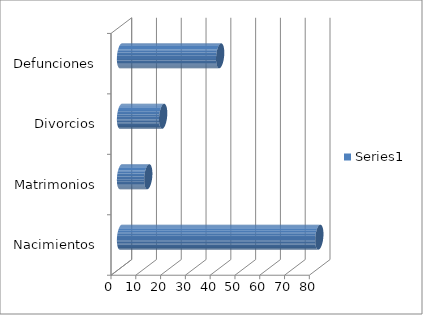
| Category | Series 0 |
|---|---|
| Nacimientos | 80 |
| Matrimonios | 11 |
| Divorcios | 17 |
| Defunciones | 40 |